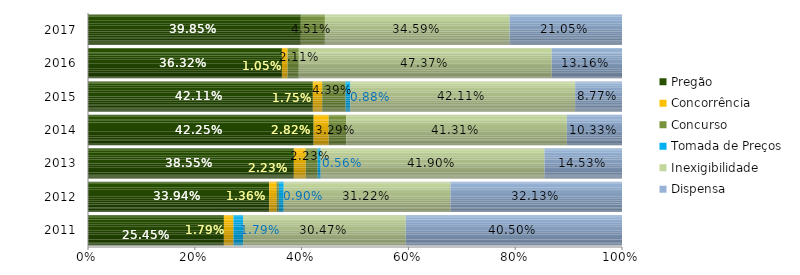
| Category | Pregão | Concorrência | Concurso | Tomada de Preços | Inexigibilidade | Dispensa |
|---|---|---|---|---|---|---|
| 2011.0 | 0.254 | 0.018 | 0 | 0.018 | 0.305 | 0.405 |
| 2012.0 | 0.339 | 0.014 | 0.005 | 0.009 | 0.312 | 0.321 |
| 2013.0 | 0.385 | 0.022 | 0.022 | 0.006 | 0.419 | 0.145 |
| 2014.0 | 0.423 | 0.028 | 0.033 | 0 | 0.413 | 0.103 |
| 2015.0 | 0.421 | 0.018 | 0.044 | 0.009 | 0.421 | 0.088 |
| 2016.0 | 0.363 | 0.011 | 0.021 | 0 | 0.474 | 0.132 |
| 2017.0 | 0.398 | 0 | 0.045 | 0 | 0.346 | 0.211 |